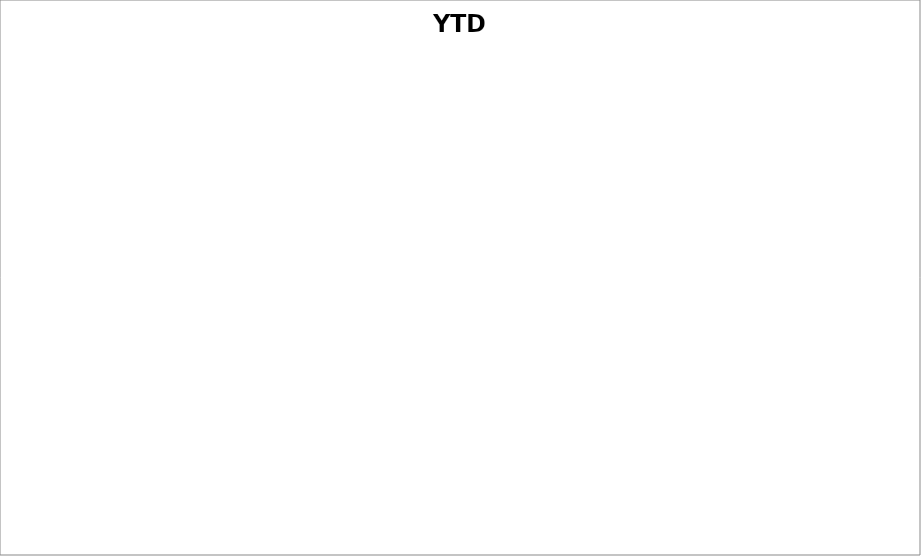
| Category | Series 0 |
|---|---|
| Household Bills | 0 |
| Insurance and financial | 0 |
| Food | 0 |
| Personal & Health | 0 |
| Entertainment | 0 |
| Transport | 0 |
| Work Related Expenses | 0 |